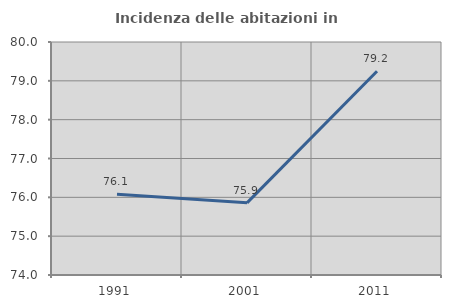
| Category | Incidenza delle abitazioni in proprietà  |
|---|---|
| 1991.0 | 76.077 |
| 2001.0 | 75.858 |
| 2011.0 | 79.248 |